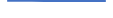
| Category | Series 0 |
|---|---|
| 0 | 59 |
| 1 | 69 |
| 2 | 62 |
| 3 | 52 |
| 4 | 45 |
| 5 | 55 |
| 6 | 46 |
| 7 | 52 |
| 8 | 55 |